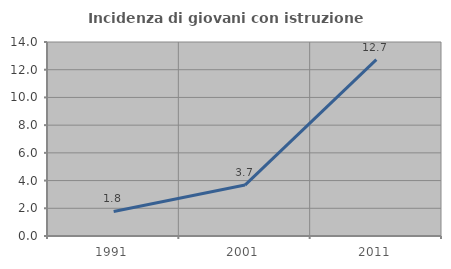
| Category | Incidenza di giovani con istruzione universitaria |
|---|---|
| 1991.0 | 1.77 |
| 2001.0 | 3.676 |
| 2011.0 | 12.727 |